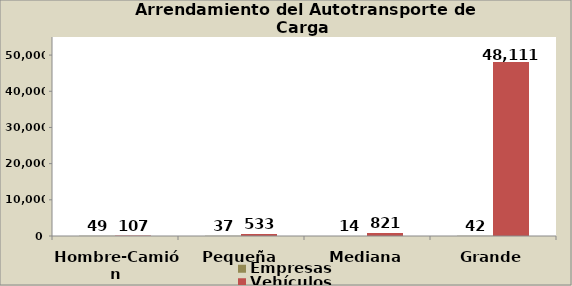
| Category | Empresas | Vehículos |
|---|---|---|
| Hombre-Camión | 49 | 107 |
| Pequeña | 37 | 533 |
| Mediana | 14 | 821 |
| Grande | 42 | 48111 |